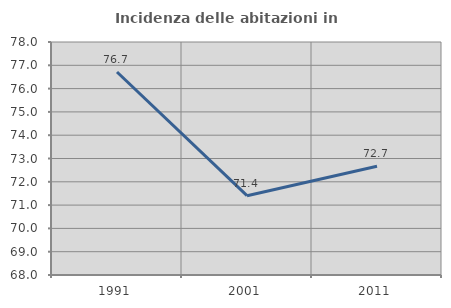
| Category | Incidenza delle abitazioni in proprietà  |
|---|---|
| 1991.0 | 76.712 |
| 2001.0 | 71.404 |
| 2011.0 | 72.665 |